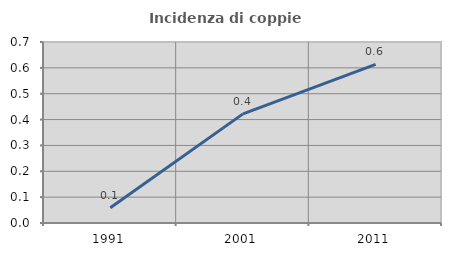
| Category | Incidenza di coppie miste |
|---|---|
| 1991.0 | 0.059 |
| 2001.0 | 0.422 |
| 2011.0 | 0.613 |